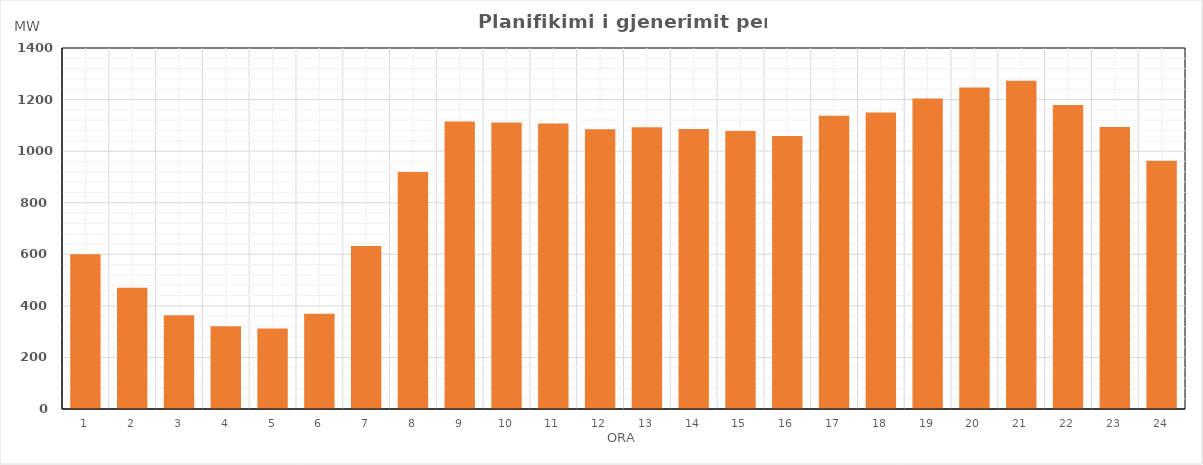
| Category | Max (MW) |
|---|---|
| 0 | 599.701 |
| 1 | 470.3 |
| 2 | 363.3 |
| 3 | 320.49 |
| 4 | 312.432 |
| 5 | 369.3 |
| 6 | 632.611 |
| 7 | 918.68 |
| 8 | 1115.17 |
| 9 | 1111.16 |
| 10 | 1107.206 |
| 11 | 1085.302 |
| 12 | 1092.196 |
| 13 | 1086.228 |
| 14 | 1078.252 |
| 15 | 1059.096 |
| 16 | 1137.088 |
| 17 | 1150.16 |
| 18 | 1204.442 |
| 19 | 1246.596 |
| 20 | 1272.851 |
| 21 | 1179.227 |
| 22 | 1093.765 |
| 23 | 962.3 |